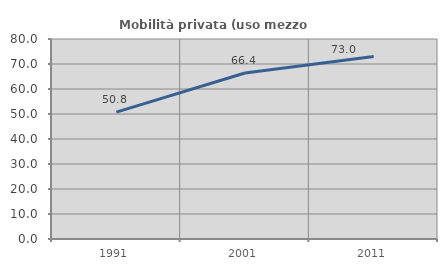
| Category | Mobilità privata (uso mezzo privato) |
|---|---|
| 1991.0 | 50.771 |
| 2001.0 | 66.419 |
| 2011.0 | 72.973 |